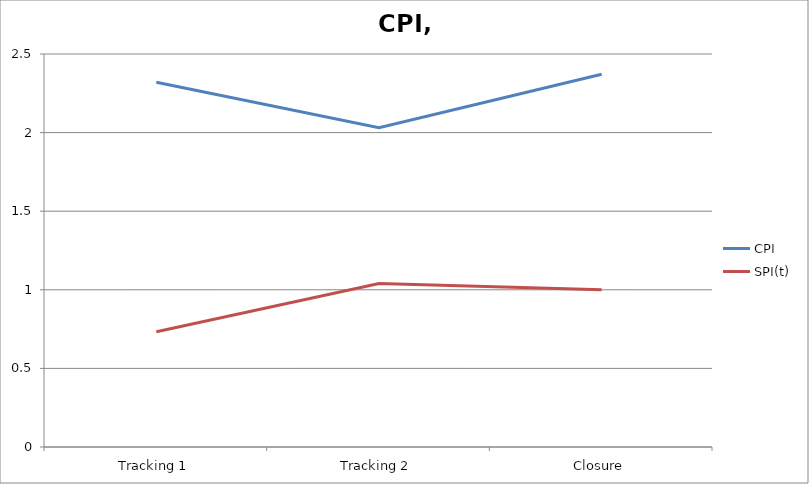
| Category | CPI | SPI(t) |
|---|---|---|
| Tracking 1 | 2.32 | 0.733 |
| Tracking 2 | 2.031 | 1.039 |
| Closure | 2.371 | 1 |